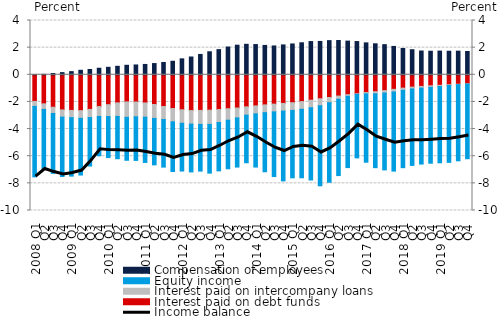
| Category | Interest paid on debt funds | Interest paid on intercompany loans | Equity income | Compensation of employees |
|---|---|---|---|---|
| 2008 Q1 | -1.964 | -0.365 | -5.194 | 0.012 |
| Q2 | -2.141 | -0.413 | -4.42 | 0.031 |
| Q3 | -2.392 | -0.457 | -4.413 | 0.095 |
| Q4 | -2.588 | -0.531 | -4.379 | 0.159 |
| 2009 Q1 | -2.624 | -0.535 | -4.307 | 0.232 |
| Q2 | -2.642 | -0.566 | -4.18 | 0.332 |
| Q3 | -2.552 | -0.602 | -3.568 | 0.389 |
| Q4 | -2.344 | -0.724 | -2.899 | 0.482 |
| 2010 Q1 | -2.203 | -0.877 | -3.023 | 0.551 |
| Q2 | -2.068 | -1 | -3.117 | 0.625 |
| Q3 | -1.998 | -1.136 | -3.166 | 0.7 |
| Q4 | -2.006 | -1.089 | -3.215 | 0.724 |
| 2011 Q1 | -2.072 | -1.051 | -3.335 | 0.762 |
| Q2 | -2.189 | -1.024 | -3.425 | 0.827 |
| Q3 | -2.337 | -0.958 | -3.508 | 0.906 |
| Q4 | -2.488 | -0.977 | -3.66 | 0.996 |
| 2012 Q1 | -2.58 | -0.994 | -3.518 | 1.174 |
| Q2 | -2.639 | -0.996 | -3.522 | 1.311 |
| Q3 | -2.623 | -1.031 | -3.444 | 1.499 |
| Q4 | -2.606 | -1.048 | -3.593 | 1.697 |
| 2013 Q1 | -2.563 | -0.952 | -3.564 | 1.853 |
| Q2 | -2.503 | -0.844 | -3.579 | 2.045 |
| Q3 | -2.449 | -0.729 | -3.621 | 2.18 |
| Q4 | -2.364 | -0.608 | -3.511 | 2.246 |
| 2014 Q1 | -2.292 | -0.586 | -3.921 | 2.228 |
| Q2 | -2.218 | -0.574 | -4.354 | 2.163 |
| Q3 | -2.161 | -0.571 | -4.766 | 2.124 |
| Q4 | -2.11 | -0.563 | -5.145 | 2.202 |
| 2015 Q1 | -2.056 | -0.566 | -4.971 | 2.273 |
| Q2 | -1.975 | -0.568 | -5.046 | 2.357 |
| Q3 | -1.873 | -0.556 | -5.323 | 2.448 |
| Q4 | -1.765 | -0.519 | -5.895 | 2.458 |
| 2016 Q1 | -1.673 | -0.383 | -5.863 | 2.517 |
| Q2 | -1.567 | -0.237 | -5.623 | 2.526 |
| Q3 | -1.467 | -0.118 | -5.252 | 2.481 |
| Q4 | -1.398 | -0.041 | -4.683 | 2.449 |
| 2017 Q1 | -1.31 | -0.092 | -5.04 | 2.352 |
| Q2 | -1.247 | -0.156 | -5.441 | 2.284 |
| Q3 | -1.167 | -0.179 | -5.663 | 2.22 |
| Q4 | -1.073 | -0.189 | -5.835 | 2.09 |
| 2018 Q1 | -0.982 | -0.161 | -5.701 | 1.939 |
| Q2 | -0.909 | -0.135 | -5.635 | 1.848 |
| Q3 | -0.858 | -0.124 | -5.597 | 1.752 |
| Q4 | -0.811 | -0.113 | -5.591 | 1.735 |
| 2019 Q1 | -0.776 | -0.092 | -5.617 | 1.746 |
| Q2 | -0.73 | -0.057 | -5.666 | 1.735 |
| Q3 | -0.696 | -0.033 | -5.61 | 1.741 |
| Q4 | -0.661 | -0.02 | -5.504 | 1.717 |